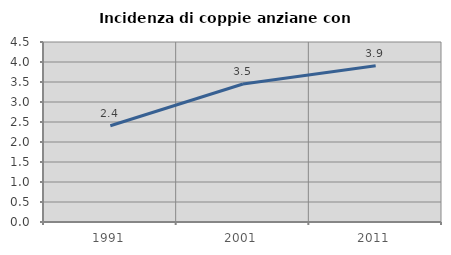
| Category | Incidenza di coppie anziane con figli |
|---|---|
| 1991.0 | 2.407 |
| 2001.0 | 3.451 |
| 2011.0 | 3.907 |